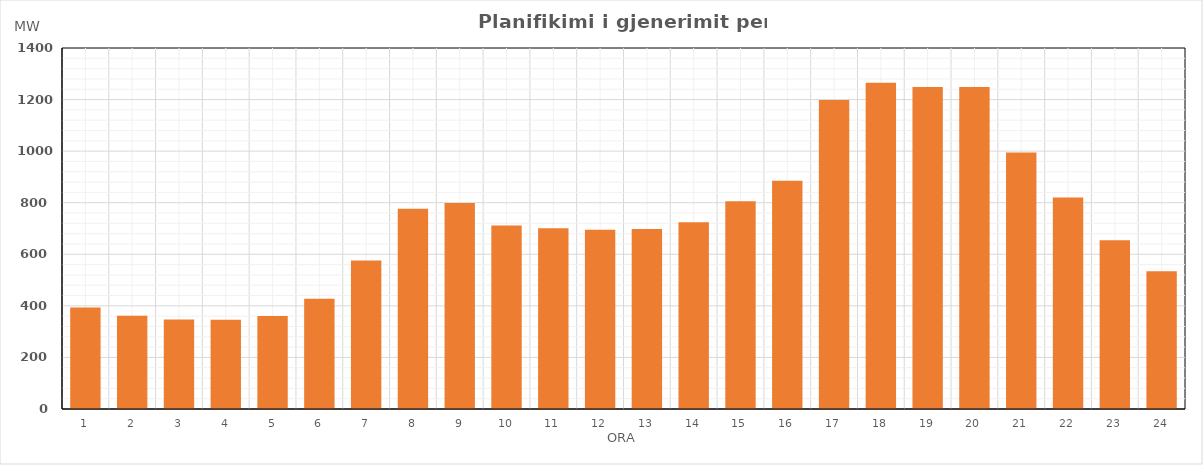
| Category | Max (MW) |
|---|---|
| 0 | 394.04 |
| 1 | 361.89 |
| 2 | 347.2 |
| 3 | 346.57 |
| 4 | 360.6 |
| 5 | 427.18 |
| 6 | 575.89 |
| 7 | 776.9 |
| 8 | 798.66 |
| 9 | 711.18 |
| 10 | 701.33 |
| 11 | 695.56 |
| 12 | 698.36 |
| 13 | 724.17 |
| 14 | 805.8 |
| 15 | 884.77 |
| 16 | 1197.96 |
| 17 | 1265.22 |
| 18 | 1248.58 |
| 19 | 1249.08 |
| 20 | 994.91 |
| 21 | 820.11 |
| 22 | 654.39 |
| 23 | 534.26 |